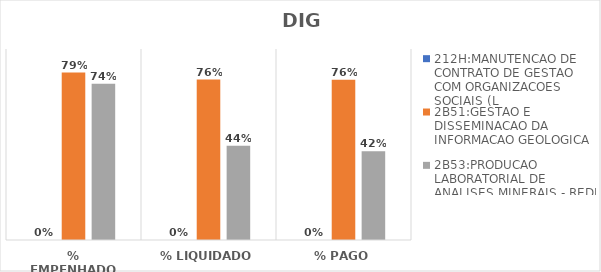
| Category | 212H:MANUTENCAO DE CONTRATO DE GESTAO COM ORGANIZACOES SOCIAIS (L | 2B51:GESTAO E DISSEMINACAO DA INFORMACAO GEOLOGICA | 2B53:PRODUCAO LABORATORIAL DE ANALISES MINERAIS - REDE LAMIN |
|---|---|---|---|
| % EMPENHADO | 0 | 0.789 | 0.737 |
| % LIQUIDADO | 0 | 0.756 | 0.444 |
| % PAGO | 0 | 0.755 | 0.418 |